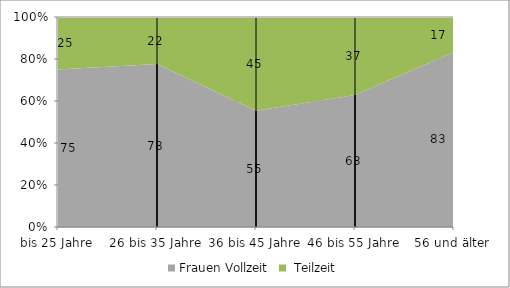
| Category | Frauen |
|---|---|
| bis 25 Jahre | 25 |
| 26 bis 35 Jahre | 22.4 |
| 36 bis 45 Jahre | 44.7 |
| 46 bis 55 Jahre | 37.1 |
| 56 und älter | 16.7 |